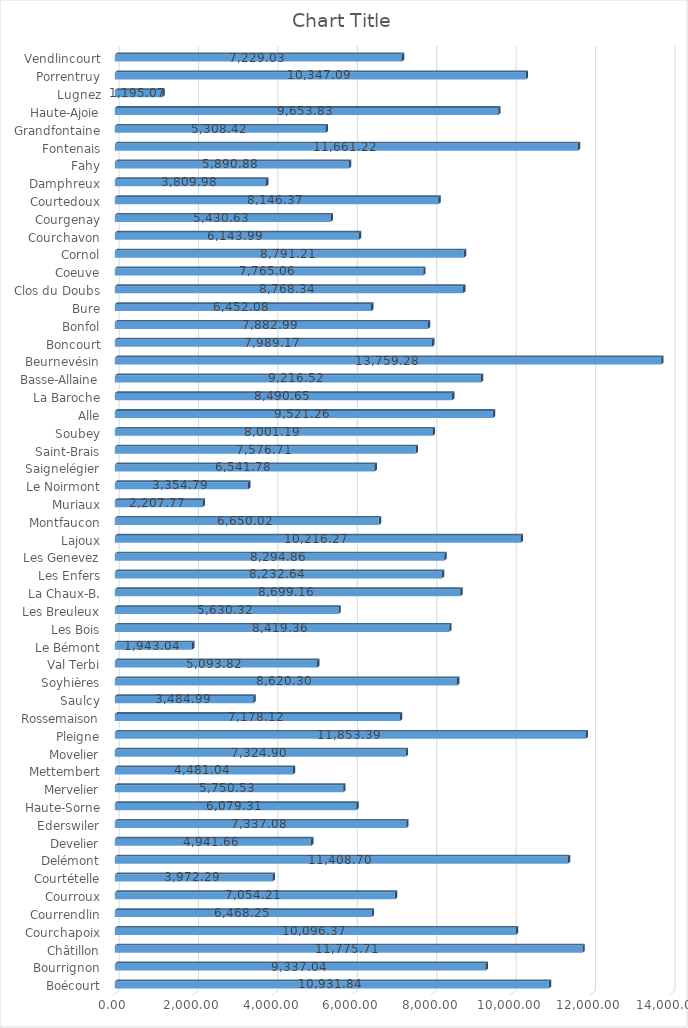
| Category | Series 0 |
|---|---|
| Boécourt | 10931.844 |
| Bourrignon | 9337.037 |
| Châtillon | 11775.711 |
| Courchapoix | 10096.369 |
| Courrendlin | 6468.248 |
| Courroux | 7054.213 |
| Courtételle | 3972.286 |
| Delémont | 11408.697 |
| Develier | 4941.658 |
| Ederswiler | 7337.081 |
| Haute-Sorne | 6079.31 |
| Mervelier | 5750.534 |
| Mettembert | 4481.044 |
| Movelier | 7324.898 |
| Pleigne | 11853.385 |
| Rossemaison | 7178.117 |
| Saulcy | 3484.986 |
| Soyhières | 8620.296 |
| Val Terbi | 5093.818 |
| Le Bémont | 1943.036 |
| Les Bois | 8419.357 |
| Les Breuleux | 5630.325 |
| La Chaux-B. | 8699.16 |
| Les Enfers | 8232.639 |
| Les Genevez | 8294.856 |
| Lajoux | 10216.27 |
| Montfaucon | 6650.017 |
| Muriaux | 2207.767 |
| Le Noirmont | 3354.794 |
| Saignelégier | 6541.781 |
| Saint-Brais | 7576.713 |
| Soubey | 8001.19 |
| Alle | 9521.263 |
| La Baroche | 8490.654 |
| Basse-Allaine | 9216.516 |
| Beurnevésin | 13759.279 |
| Boncourt | 7989.171 |
| Bonfol | 7882.99 |
| Bure | 6452.08 |
| Clos du Doubs | 8768.336 |
| Coeuve | 7765.055 |
| Cornol | 8791.213 |
| Courchavon | 6143.994 |
| Courgenay | 5430.631 |
| Courtedoux | 8146.37 |
| Damphreux | 3809.976 |
| Fahy | 5890.877 |
| Fontenais | 11661.222 |
| Grandfontaine | 5308.421 |
| Haute-Ajoie | 9653.833 |
| Lugnez | 1195.068 |
| Porrentruy | 10347.085 |
| Vendlincourt | 7229.026 |